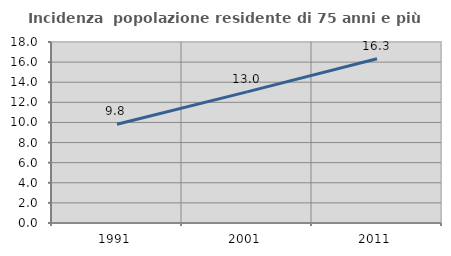
| Category | Incidenza  popolazione residente di 75 anni e più |
|---|---|
| 1991.0 | 9.814 |
| 2001.0 | 13.043 |
| 2011.0 | 16.329 |